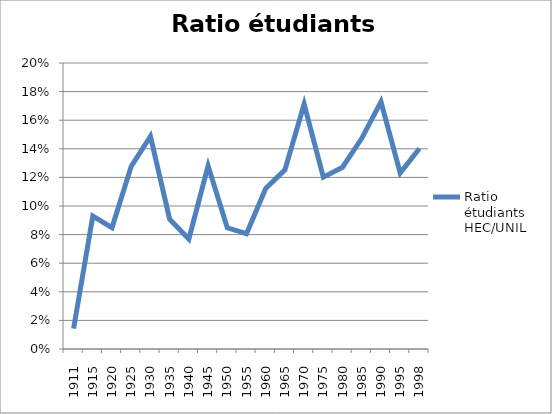
| Category | Ratio étudiants HEC/UNIL |
|---|---|
| 1911.0 | 0.014 |
| 1915.0 | 0.093 |
| 1920.0 | 0.085 |
| 1925.0 | 0.128 |
| 1930.0 | 0.149 |
| 1935.0 | 0.091 |
| 1940.0 | 0.077 |
| 1945.0 | 0.128 |
| 1950.0 | 0.085 |
| 1955.0 | 0.081 |
| 1960.0 | 0.112 |
| 1965.0 | 0.125 |
| 1970.0 | 0.171 |
| 1975.0 | 0.12 |
| 1980.0 | 0.127 |
| 1985.0 | 0.147 |
| 1990.0 | 0.173 |
| 1995.0 | 0.123 |
| 1998.0 | 0.14 |